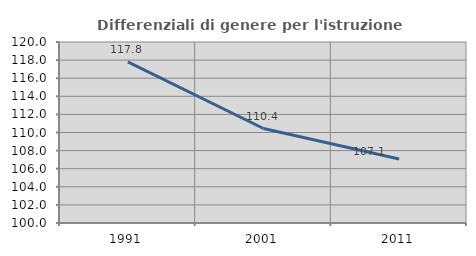
| Category | Differenziali di genere per l'istruzione superiore |
|---|---|
| 1991.0 | 117.806 |
| 2001.0 | 110.442 |
| 2011.0 | 107.074 |